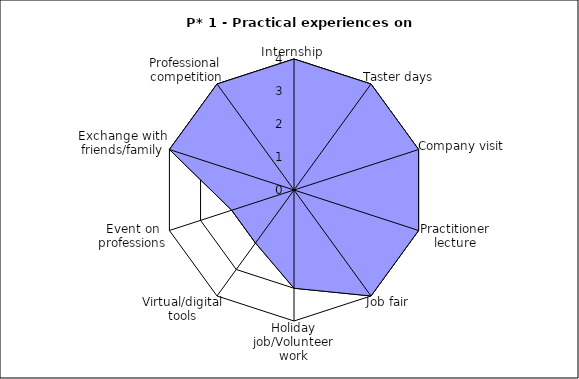
| Category | Series 1 | Series 0 |
|---|---|---|
| Internship | 4 | 4 |
| Taster days | 4 | 4 |
| Company visit | 4 | 4 |
| Practitioner lecture | 4 | 4 |
| Job fair | 4 | 4 |
| Holiday job/Volunteer work | 3 | 3 |
| Virtual/digital tools | 2 | 2 |
| Event on professions | 2 | 2 |
| Exchange with friends/family | 4 | 4 |
| Professional competition | 4 | 4 |